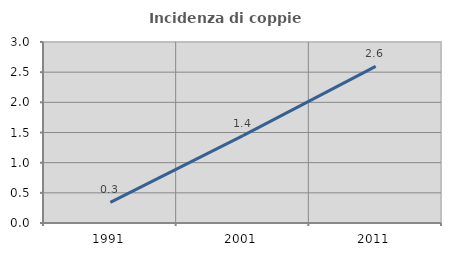
| Category | Incidenza di coppie miste |
|---|---|
| 1991.0 | 0.341 |
| 2001.0 | 1.447 |
| 2011.0 | 2.595 |